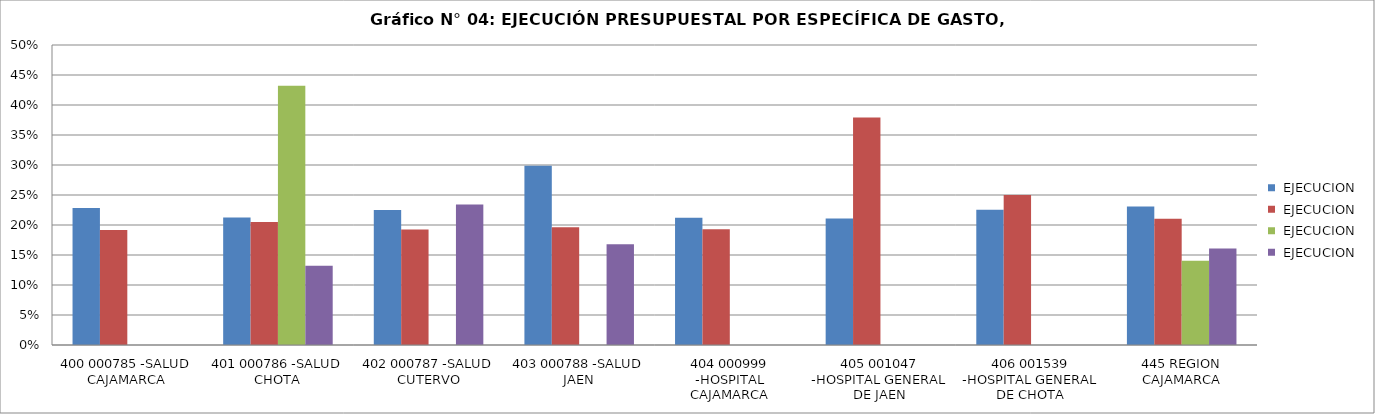
| Category | 2 . 1 PERSONAL Y OBLIGACIONES SOCIALES EJECUCION | 2 . 3 BIENES Y SERVICIOS EJECUCION | 2 . 6 ADQUISICION DE ACTIVOS NO FINANCIEROS EJECUCION | 2 . 5 OTROS GASTOS EJECUCION |
|---|---|---|---|---|
| 400 000785 -SALUD CAJAMARCA | 0.228 | 0.192 | 0 | 0 |
| 401 000786 -SALUD CHOTA | 0.212 | 0.205 | 0.432 | 0.132 |
| 402 000787 -SALUD CUTERVO | 0.225 | 0.193 | 0 | 0.234 |
| 403 000788 -SALUD JAEN | 0.299 | 0.196 | 0 | 0.168 |
| 404 000999 -HOSPITAL CAJAMARCA | 0.212 | 0.193 | 0 | 0 |
| 405 001047 -HOSPITAL GENERAL DE JAEN | 0.211 | 0.379 | 0 | 0 |
| 406 001539 -HOSPITAL GENERAL DE CHOTA | 0.226 | 0.25 | 0 | 0 |
| 445 REGION CAJAMARCA | 0.231 | 0.21 | 0.14 | 0.161 |